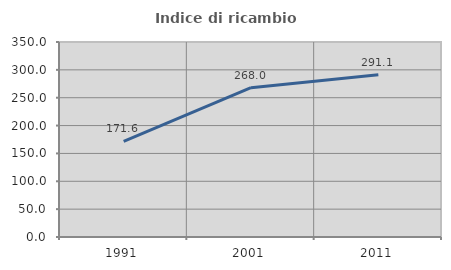
| Category | Indice di ricambio occupazionale  |
|---|---|
| 1991.0 | 171.615 |
| 2001.0 | 268.029 |
| 2011.0 | 291.135 |